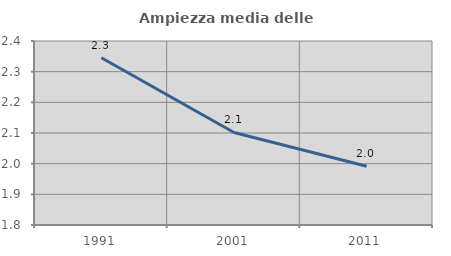
| Category | Ampiezza media delle famiglie |
|---|---|
| 1991.0 | 2.345 |
| 2001.0 | 2.102 |
| 2011.0 | 1.991 |